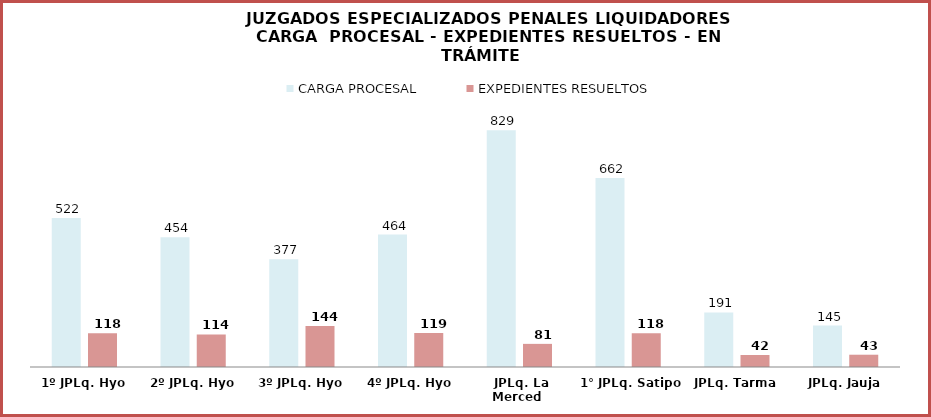
| Category | CARGA PROCESAL | EXPEDIENTES RESUELTOS |
|---|---|---|
| 1º JPLq. Hyo | 522 | 118 |
| 2º JPLq. Hyo | 454 | 114 |
| 3º JPLq. Hyo | 377 | 144 |
| 4º JPLq. Hyo | 464 | 119 |
| JPLq. La Merced | 829 | 81 |
| 1° JPLq. Satipo | 662 | 118 |
| JPLq. Tarma | 191 | 42 |
| JPLq. Jauja | 145 | 43 |